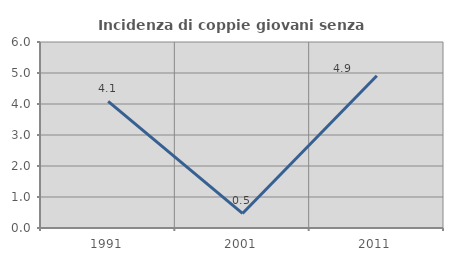
| Category | Incidenza di coppie giovani senza figli |
|---|---|
| 1991.0 | 4.082 |
| 2001.0 | 0.469 |
| 2011.0 | 4.911 |